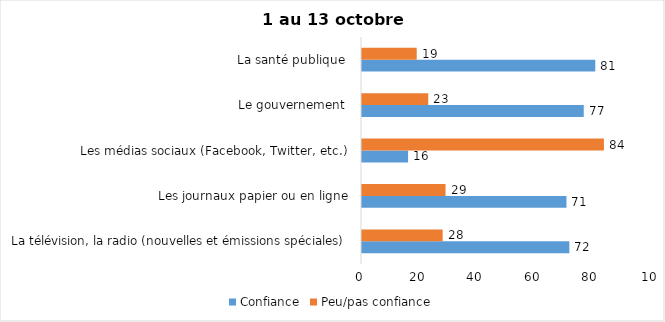
| Category | Confiance | Peu/pas confiance |
|---|---|---|
| La télévision, la radio (nouvelles et émissions spéciales) | 72 | 28 |
| Les journaux papier ou en ligne | 71 | 29 |
| Les médias sociaux (Facebook, Twitter, etc.) | 16 | 84 |
| Le gouvernement  | 77 | 23 |
| La santé publique  | 81 | 19 |